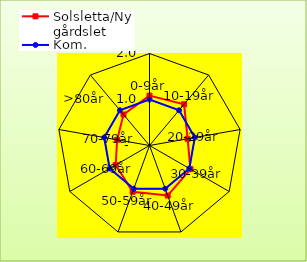
| Category | Solsletta/Nygårdslet | Kom. |
|---|---|---|
| 0-9år | 1.084 | 1 |
| 10-19år | 1.17 | 1 |
| 20-29år | 0.842 | 1 |
| 30-39år | 1.027 | 1 |
| 40-49år | 1.158 | 1 |
| 50-59år | 1.069 | 1 |
| 60-69år | 0.849 | 1 |
| 70-79år | 0.715 | 1 |
| >80år | 0.88 | 1 |